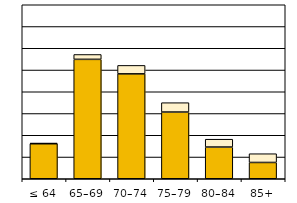
| Category | sólo  Single pension | v souběh  Combined pension |
|---|---|---|
| ≤ 64 | 80516 | 1526 |
| 65–69 | 274517 | 11185 |
| 70–74 | 241160 | 19413 |
| 75–79 | 153342 | 21541 |
| 80–84 | 72898 | 18045 |
| 85+ | 37432 | 20115 |